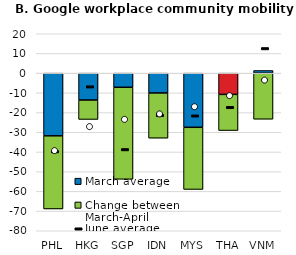
| Category | March average | Change between March-April |
|---|---|---|
| PHL | -31.806 | -37.127 |
| HKG | -13.645 | -9.855 |
| SGP | -7.161 | -46.705 |
| IDN | -10.065 | -22.935 |
| MYS | -27.484 | -31.549 |
| THA | -10.774 | -18.359 |
| VNM | 1.355 | -23.388 |